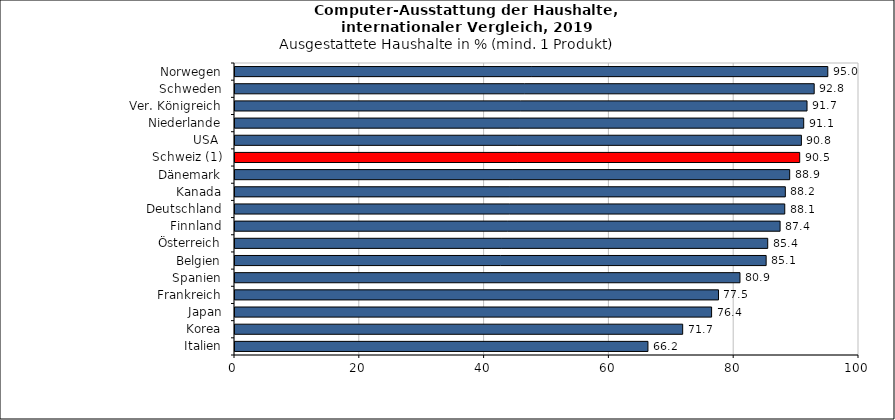
| Category | Italien |
|---|---|
| Italien | 66.176 |
| Korea | 71.744 |
| Japan | 76.379 |
| Frankreich | 77.483 |
| Spanien | 80.926 |
| Belgien | 85.119 |
| Österreich | 85.373 |
| Finnland | 87.355 |
| Deutschland | 88.102 |
| Kanada | 88.194 |
| Dänemark | 88.891 |
| Schweiz (1) | 90.496 |
| USA  | 90.77 |
| Niederlande | 91.139 |
| Ver. Königreich | 91.67 |
| Schweden | 92.82 |
| Norwegen | 95 |